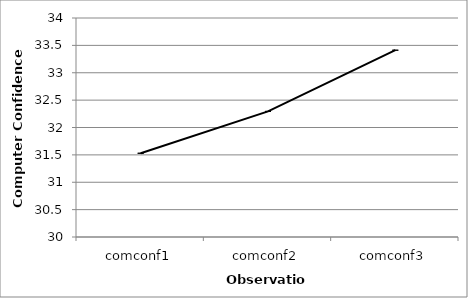
| Category | Series 0 |
|---|---|
| comconf1 | 31.529 |
| comconf2 | 32.294 |
| comconf3 | 33.412 |